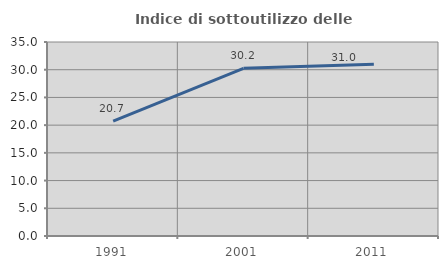
| Category | Indice di sottoutilizzo delle abitazioni  |
|---|---|
| 1991.0 | 20.741 |
| 2001.0 | 30.249 |
| 2011.0 | 30.968 |